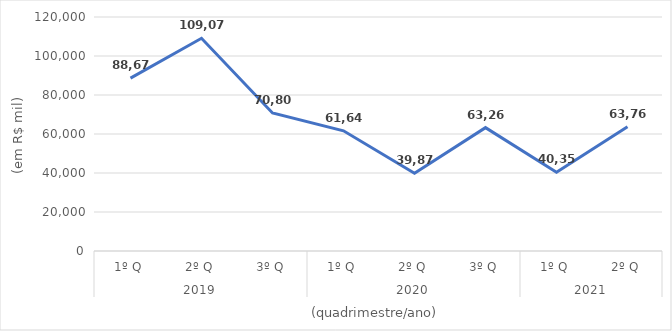
| Category | Total |
|---|---|
| 0 | 88677425.865 |
| 1 | 109070161.367 |
| 2 | 70805380.036 |
| 3 | 61642466.394 |
| 4 | 39876797.945 |
| 5 | 63268144.725 |
| 6 | 40358551.505 |
| 7 | 63767926.74 |